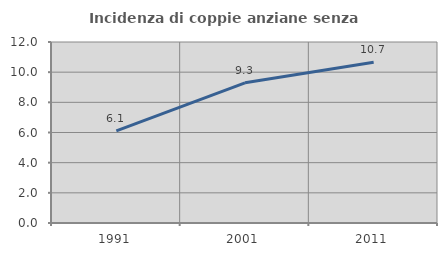
| Category | Incidenza di coppie anziane senza figli  |
|---|---|
| 1991.0 | 6.104 |
| 2001.0 | 9.293 |
| 2011.0 | 10.659 |